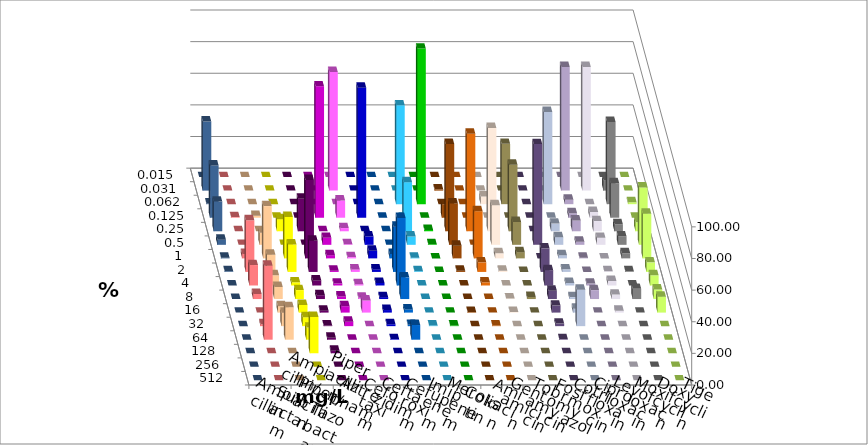
| Category | Ampicillin | Ampicillin/ Sulbactam | Piperacillin | Piperacillin/ Tazobactam | Aztreonam | Cefotaxim | Ceftazidim | Cefuroxim | Imipenem | Meropenem | Colistin | Amikacin | Gentamicin | Tobramycin | Fosfomycin | Cotrimoxazol | Ciprofloxacin | Levofloxacin | Moxifloxacin | Doxycyclin | Tigecyclin |
|---|---|---|---|---|---|---|---|---|---|---|---|---|---|---|---|---|---|---|---|---|---|
| 0.015 | 0 | 0 | 0 | 0 | 0 | 0 | 0 | 0 | 0 | 0 | 0 | 0 | 0 | 0 | 0 | 0 | 0 | 0 | 0 | 0 | 0 |
| 0.031 | 0 | 0 | 0 | 0 | 0 | 75 | 0 | 0 | 0 | 0 | 0.806 | 0 | 0 | 0 | 0 | 0 | 78.226 | 78.226 | 6.452 | 0 | 43.673 |
| 0.062 | 0 | 0 | 0 | 0 | 0 | 0 | 0 | 0 | 62.5 | 98.387 | 0 | 0 | 4.839 | 38.158 | 0 | 58.3 | 2.823 | 0 | 52.016 | 1.21 | 0.408 |
| 0.125 | 0.403 | 1.21 | 0 | 0 | 83.065 | 10.887 | 82.258 | 0 | 0 | 0 | 8.468 | 0 | 0 | 0 | 0 | 0 | 2.823 | 3.629 | 21.774 | 0 | 33.061 |
| 0.25 | 0 | 0 | 7.661 | 20.565 | 0 | 2.016 | 0 | 0 | 31.048 | 0.806 | 55.242 | 61.694 | 65.323 | 42.105 | 0 | 4.858 | 6.855 | 6.452 | 4.435 | 5.645 | 18.776 |
| 0.5 | 0 | 7.661 | 0 | 0 | 4.435 | 0.403 | 5.242 | 0 | 5.242 | 0.403 | 26.21 | 0 | 25 | 14.474 | 63.71 | 4.858 | 2.016 | 4.435 | 5.242 | 36.29 | 3.265 |
| 1.0 | 2.823 | 33.065 | 26.21 | 49.597 | 2.016 | 0.806 | 4.839 | 2.823 | 0.403 | 0 | 8.065 | 29.839 | 3.226 | 3.947 | 0 | 2.024 | 0.403 | 0 | 3.226 | 28.226 | 0.408 |
| 2.0 | 32.661 | 10.887 | 17.339 | 19.758 | 0.806 | 1.613 | 1.613 | 28.629 | 0.403 | 0 | 0.806 | 6.048 | 0.806 | 0 | 14.919 | 1.619 | 0 | 0.403 | 0.403 | 6.048 | 0.408 |
| 4.0 | 12.903 | 6.452 | 2.016 | 3.226 | 1.21 | 0.806 | 1.613 | 42.742 | 0 | 0 | 0 | 2.016 | 0 | 0 | 9.677 | 1.619 | 1.21 | 2.823 | 0 | 6.452 | 0 |
| 8.0 | 3.226 | 7.661 | 5.645 | 2.419 | 1.613 | 0.806 | 1.21 | 13.71 | 0 | 0 | 0 | 0 | 0.403 | 1.316 | 5.242 | 1.215 | 5.645 | 2.823 | 6.452 | 6.048 | 0 |
| 16.0 | 0 | 4.032 | 4.839 | 1.21 | 4.032 | 7.661 | 1.613 | 2.016 | 0 | 0 | 0.403 | 0 | 0.403 | 0 | 4.435 | 2.429 | 0 | 1.21 | 0 | 10.081 | 0 |
| 32.0 | 1.21 | 8.468 | 5.645 | 0.403 | 2.823 | 0 | 1.21 | 0.806 | 0.403 | 0.403 | 0 | 0.403 | 0 | 0 | 1.613 | 23.077 | 0 | 0 | 0 | 0 | 0 |
| 64.0 | 46.774 | 20.565 | 7.661 | 1.21 | 0 | 0 | 0.403 | 9.274 | 0 | 0 | 0 | 0 | 0 | 0 | 0.403 | 0 | 0 | 0 | 0 | 0 | 0 |
| 128.0 | 0 | 0 | 22.984 | 1.613 | 0 | 0 | 0 | 0 | 0 | 0 | 0 | 0 | 0 | 0 | 0 | 0 | 0 | 0 | 0 | 0 | 0 |
| 256.0 | 0 | 0 | 0 | 0 | 0 | 0 | 0 | 0 | 0 | 0 | 0 | 0 | 0 | 0 | 0 | 0 | 0 | 0 | 0 | 0 | 0 |
| 512.0 | 0 | 0 | 0 | 0 | 0 | 0 | 0 | 0 | 0 | 0 | 0 | 0 | 0 | 0 | 0 | 0 | 0 | 0 | 0 | 0 | 0 |